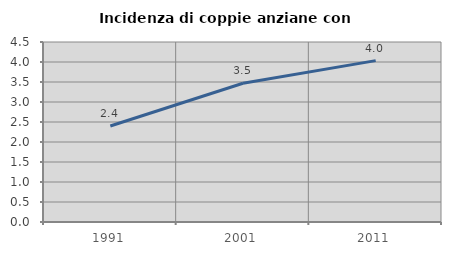
| Category | Incidenza di coppie anziane con figli |
|---|---|
| 1991.0 | 2.4 |
| 2001.0 | 3.469 |
| 2011.0 | 4.034 |